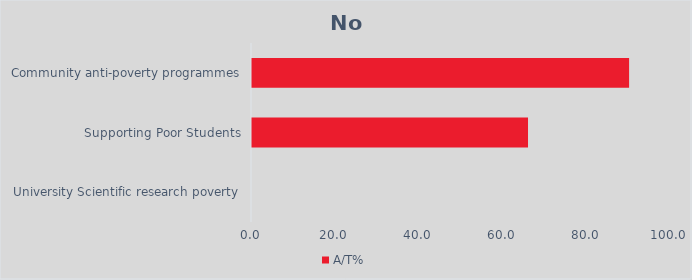
| Category | A/T% |
|---|---|
| University Scientific research poverty | 0 |
| Supporting Poor Students | 65.874 |
| Community anti-poverty programmes | 90 |